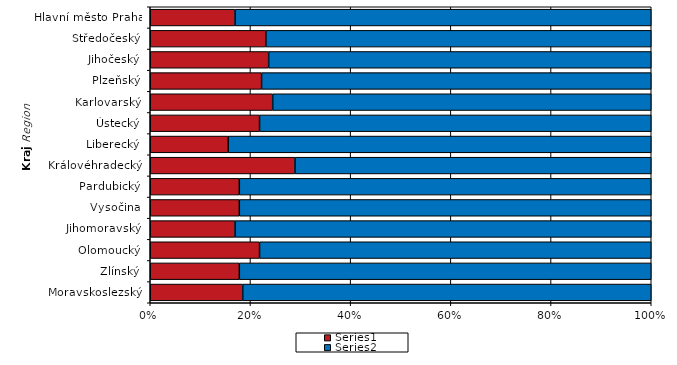
| Category | Series 0 | Series 1 |
|---|---|---|
| Hlavní město Praha | 11 | 54 |
| Středočeský | 15 | 50 |
| Jihočeský | 13 | 42 |
| Plzeňský | 10 | 35 |
| Karlovarský | 11 | 34 |
| Ústecký | 12 | 43 |
| Liberecký | 7 | 38 |
| Královéhradecký | 13 | 32 |
| Pardubický | 8 | 37 |
| Vysočina | 8 | 37 |
| Jihomoravský | 11 | 54 |
| Olomoucký | 12 | 43 |
| Zlínský | 8 | 37 |
| Moravskoslezský | 12 | 53 |